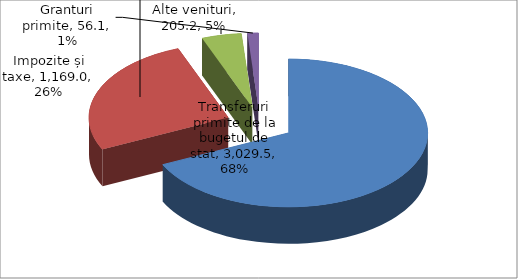
| Category | Series 0 |
|---|---|
| Transferuri primite de la bugetul de stat | 3029.5 |
| Impozite și taxe | 1169 |
| Alte venituri | 205.2 |
| Granturi primite | 56.1 |